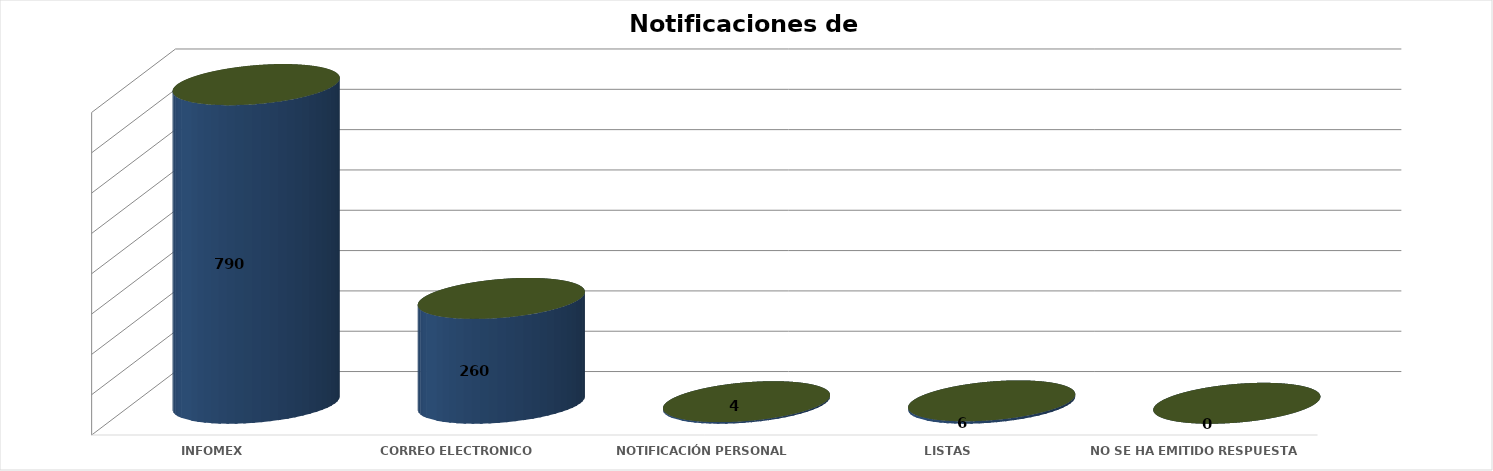
| Category | Series 0 | Series 1 | Series 2 | Series 3 | Series 4 |
|---|---|---|---|---|---|
| INFOMEX |  |  |  | 790 | 0.745 |
| CORREO ELECTRONICO |  |  |  | 260 | 0.245 |
| NOTIFICACIÓN PERSONAL |  |  |  | 4 | 0.004 |
| LISTAS |  |  |  | 6 | 0.006 |
|  NO SE HA EMITIDO RESPUESTA |  |  |  | 0 | 0 |